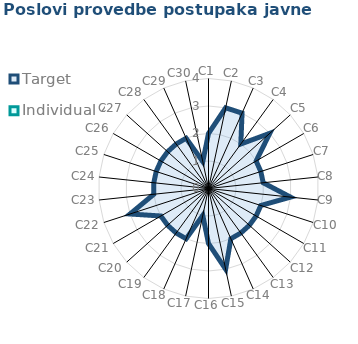
| Category | Target | Individual 4 |
|---|---|---|
| C1 | 2 | 0 |
| C2 | 3 | 0 |
| C3 | 3 | 0 |
| C4 | 2 | 0 |
| C5 | 3 | 0 |
| C6 | 2 | 0 |
| C7 | 2 | 0 |
| C8 | 2 | 0 |
| C9 | 3 | 0 |
| C10 | 2 | 0 |
| C11 | 2 | 0 |
| C12 | 2 | 0 |
| C13 | 2 | 0 |
| C14 | 2 | 0 |
| C15 | 3 | 0 |
| C16 | 2 | 0 |
| C17 | 1 | 0 |
| C18 | 2 | 0 |
| C19 | 2 | 0 |
| C20 | 2 | 0 |
| C21 | 2 | 0 |
| C22 | 3 | 0 |
| C23 | 2 | 0 |
| C24 | 2 | 0 |
| C25 | 2 | 0 |
| C26 | 2 | 0 |
| C27 | 2 | 0 |
| C28 | 2 | 0 |
| C29 | 2 | 0 |
| C30 | 1 | 0 |